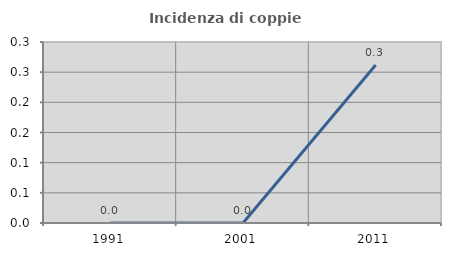
| Category | Incidenza di coppie miste |
|---|---|
| 1991.0 | 0 |
| 2001.0 | 0 |
| 2011.0 | 0.262 |